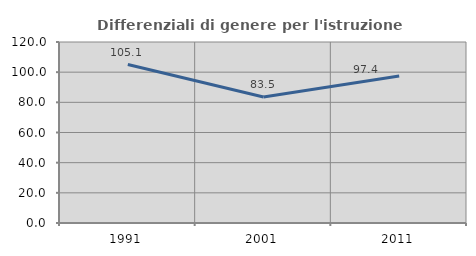
| Category | Differenziali di genere per l'istruzione superiore |
|---|---|
| 1991.0 | 105.07 |
| 2001.0 | 83.495 |
| 2011.0 | 97.394 |